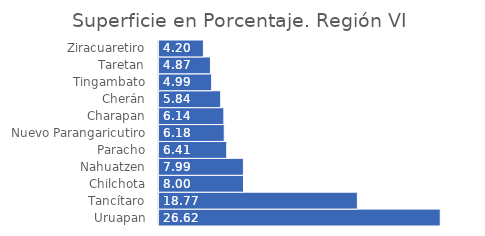
| Category | % |
|---|---|
| Uruapan | 26.617 |
| Tancítaro | 18.774 |
| Chilchota | 7.998 |
| Nahuatzen | 7.989 |
| Paracho | 6.413 |
| Nuevo Parangaricutiro | 6.176 |
| Charapan | 6.139 |
| Cherán | 5.839 |
| Tingambato | 4.986 |
| Taretan | 4.865 |
| Ziracuaretiro | 4.204 |